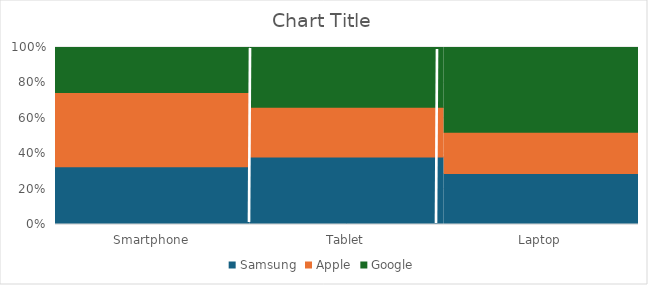
| Category | Samsung | Apple | Google |
|---|---|---|---|
| Smartphone | 0.45 | 0.58 | 0.35 |
| Tablet | 0.34 | 0.25 | 0.3 |
| Laptop | 0.21 | 0.17 | 0.35 |